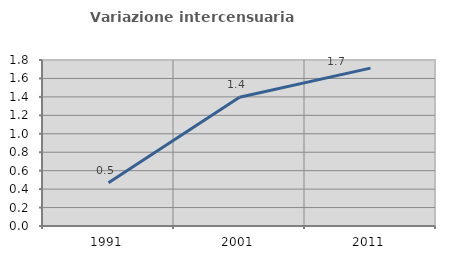
| Category | Variazione intercensuaria annua |
|---|---|
| 1991.0 | 0.469 |
| 2001.0 | 1.397 |
| 2011.0 | 1.712 |